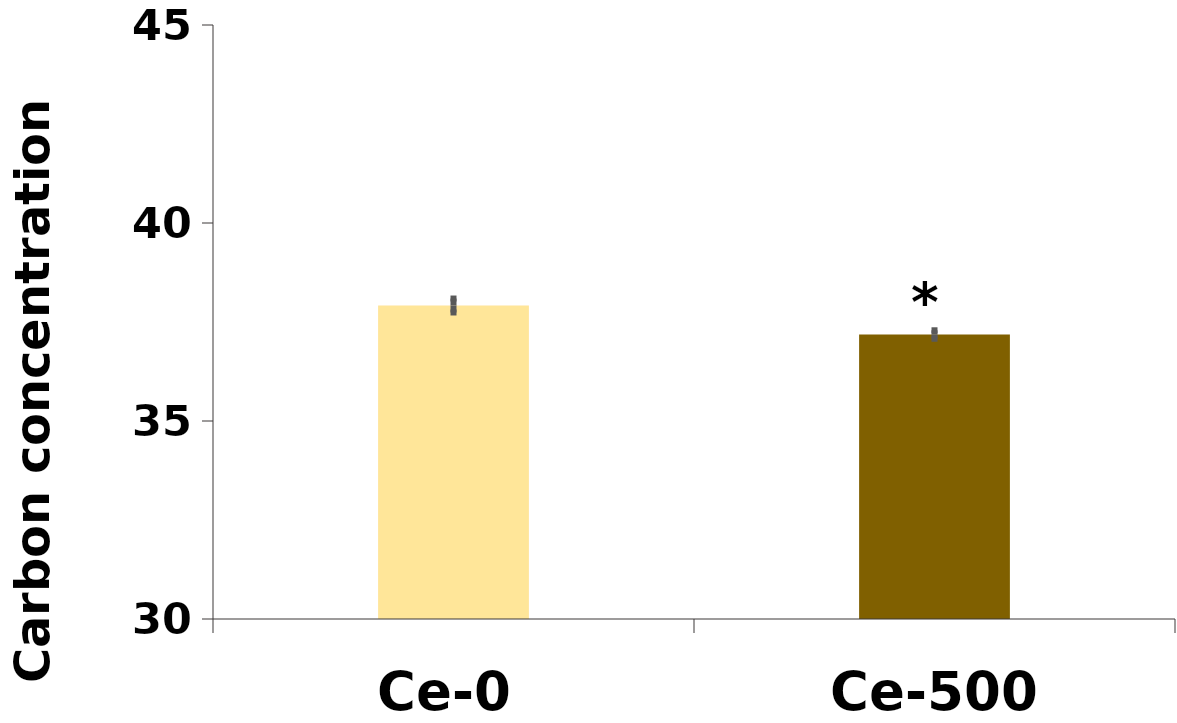
| Category | %C |
|---|---|
| Ce-0 | 37.917 |
| Ce-500 | 37.184 |